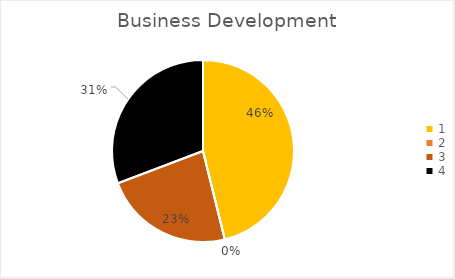
| Category | Series 0 |
|---|---|
| 0 | 0.462 |
| 1 | 0 |
| 2 | 0.231 |
| 3 | 0.308 |